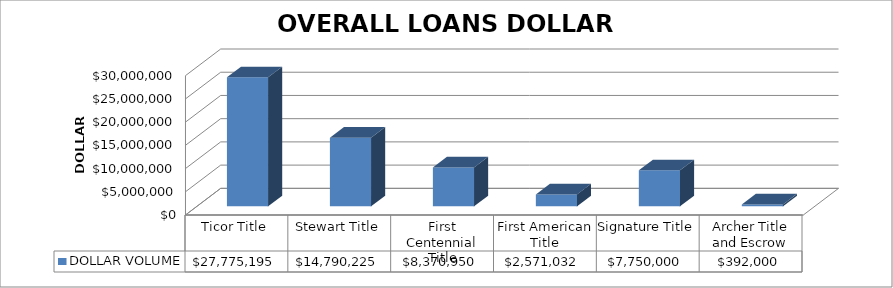
| Category | DOLLAR VOLUME |
|---|---|
| Ticor Title | 27775195 |
| Stewart Title | 14790225 |
| First Centennial Title | 8370950 |
| First American Title | 2571032 |
| Signature Title | 7750000 |
| Archer Title and Escrow | 392000 |